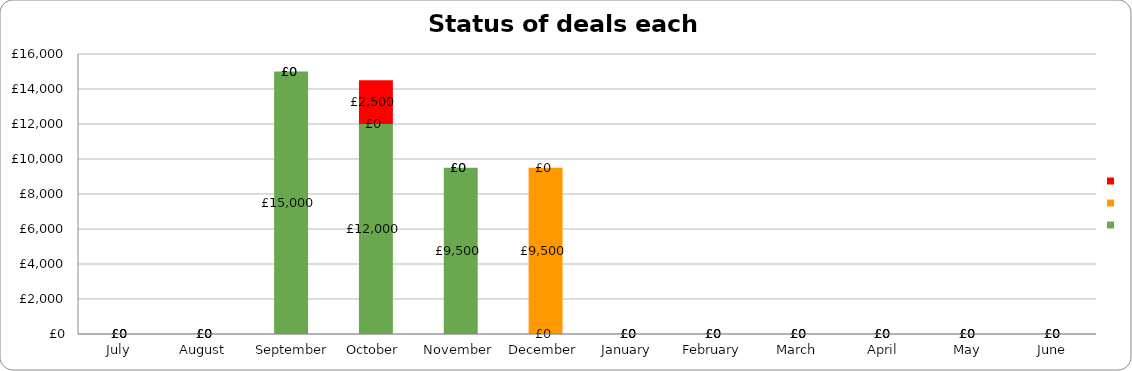
| Category | Series 0 | Series 1 | Series 2 |
|---|---|---|---|
| 2019-07-01 | 0 | 0 | 0 |
| 2019-08-01 | 0 | 0 | 0 |
| 2019-09-01 | 15000 | 0 | 0 |
| 2019-10-01 | 12000 | 0 | 2500 |
| 2019-11-01 | 9500 | 0 | 0 |
| 2019-12-01 | 0 | 9500 | 0 |
| 2020-01-01 | 0 | 0 | 0 |
| 2020-02-01 | 0 | 0 | 0 |
| 2020-03-01 | 0 | 0 | 0 |
| 2020-04-01 | 0 | 0 | 0 |
| 2020-05-01 | 0 | 0 | 0 |
| 2020-06-01 | 0 | 0 | 0 |